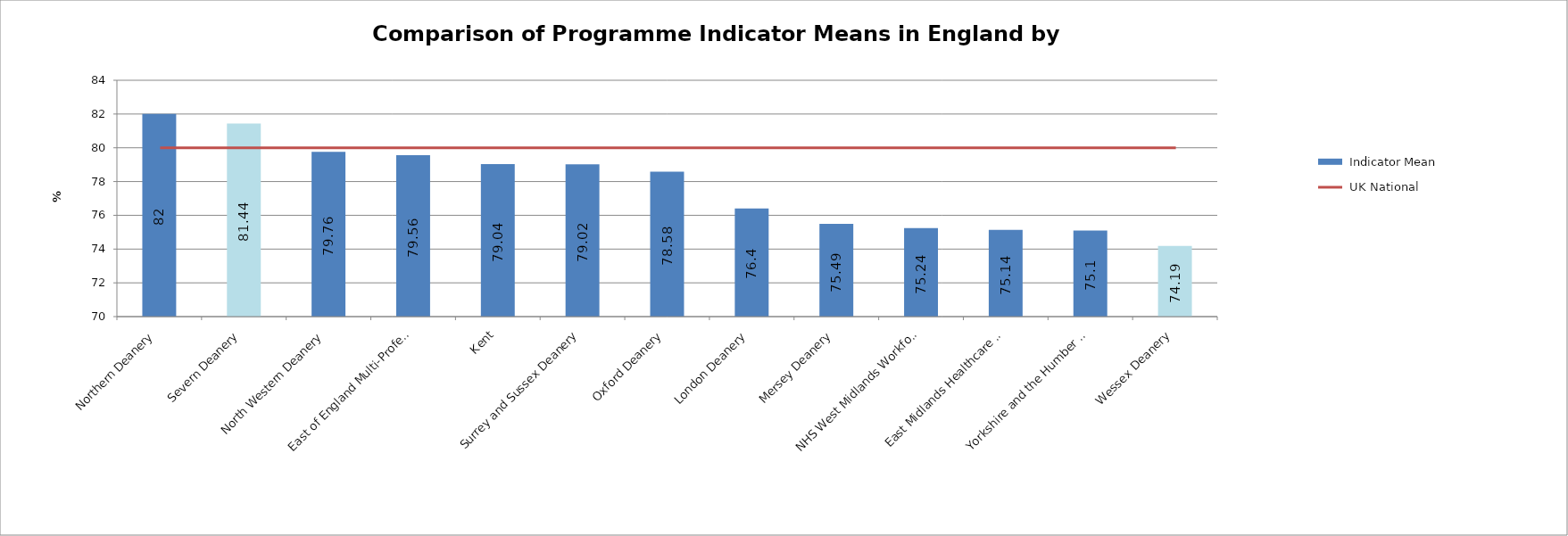
| Category |  Indicator Mean |
|---|---|
| Northern Deanery | 82 |
| Severn Deanery | 81.44 |
| North Western Deanery | 79.76 |
| East of England Multi-Professional Deanery | 79.56 |
| Kent, Surrey and Sussex Deanery | 79.04 |
| Oxford Deanery | 79.02 |
| London Deanery | 78.58 |
| Mersey Deanery | 76.4 |
| NHS West Midlands Workforce Deanery | 75.49 |
| East Midlands Healthcare Workforce Deanery | 75.24 |
| Yorkshire and the Humber Postgraduate Deanery | 75.14 |
| Wessex Deanery | 75.1 |
| South West Peninsula Deanery | 74.19 |